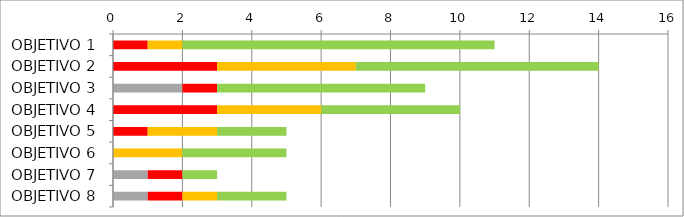
| Category | Series 0 | Series 1 | Series 2 | Series 3 | Series 4 | Series 5 |
|---|---|---|---|---|---|---|
| OBJETIVO 1 | 0 | 0 | 1 | 1 | 9 | 0 |
| OBJETIVO 2 | 0 | 0 | 3 | 4 | 7 | 0 |
| OBJETIVO 3 | 0 | 2 | 1 | 0 | 6 | 0 |
| OBJETIVO 4 | 0 | 0 | 3 | 3 | 4 | 0 |
| OBJETIVO 5 | 0 | 0 | 1 | 2 | 2 | 0 |
| OBJETIVO 6 | 0 | 0 | 0 | 2 | 3 | 0 |
| OBJETIVO 7 | 0 | 1 | 1 | 0 | 1 | 0 |
| OBJETIVO 8 | 0 | 1 | 1 | 1 | 2 | 0 |